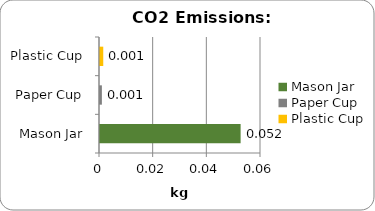
| Category | Series 0 |
|---|---|
| Mason Jar | 0.052 |
| Paper Cup | 0.001 |
| Plastic Cup | 0.001 |